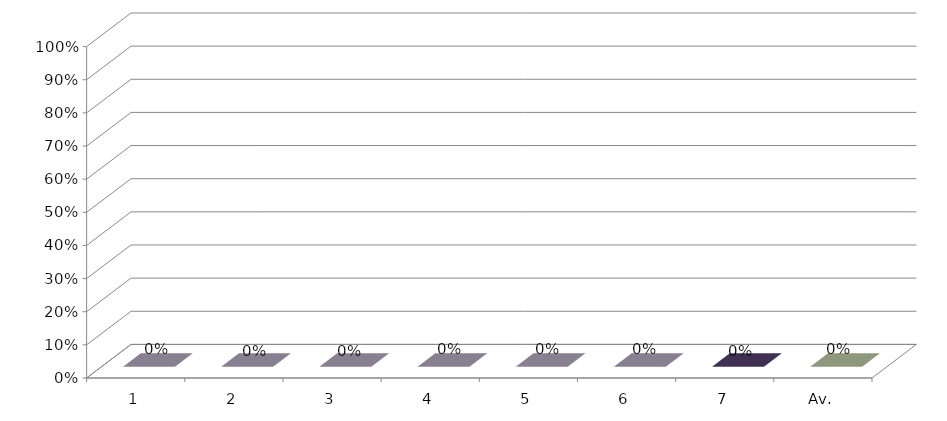
| Category | Series 3 |
|---|---|
| 1 | 0 |
| 2 | 0 |
| 3 | 0 |
| 4 | 0 |
| 5 | 0 |
| 6 | 0 |
| 7 | 0 |
| Av. | 0 |